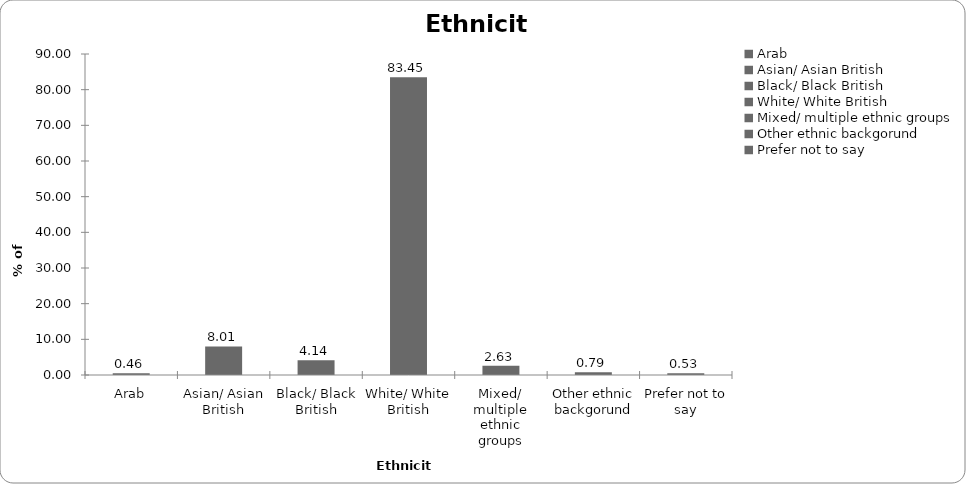
| Category | Ethnicity |
|---|---|
| Arab | 0.46 |
| Asian/ Asian British | 8.011 |
| Black/ Black British | 4.137 |
| White/ White British | 83.454 |
| Mixed/ multiple ethnic groups | 2.626 |
| Other ethnic backgorund | 0.788 |
| Prefer not to say | 0.525 |